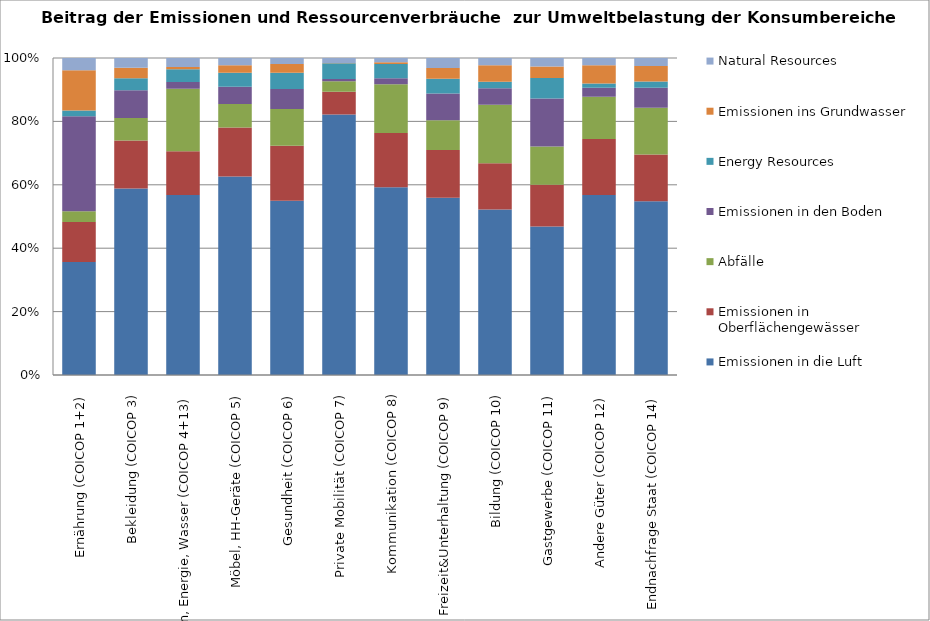
| Category | Emissionen in die Luft | Emissionen in Oberflächengewässer | Abfälle | Emissionen in den Boden | Energy Resources | Emissionen ins Grundwasser | Natural Resources |
|---|---|---|---|---|---|---|---|
| Ernährung (COICOP 1+2) | 0.1 | 0.035 | 0.01 | 0.084 | 0.005 | 0.036 | 0.011 |
| Bekleidung (COICOP 3) | 0.014 | 0.004 | 0.002 | 0.002 | 0.001 | 0.001 | 0.001 |
| Wohnen, Energie, Wasser (COICOP 4+13) | 0.138 | 0.034 | 0.048 | 0.005 | 0.01 | 0.002 | 0.007 |
| Möbel, HH-Geräte (COICOP 5) | 0.02 | 0.005 | 0.002 | 0.002 | 0.001 | 0.001 | 0.001 |
| Gesundheit (COICOP 6) | 0.039 | 0.012 | 0.008 | 0.005 | 0.004 | 0.002 | 0.001 |
| Private Mobilität (COICOP 7) | 0.101 | 0.009 | 0.004 | 0.001 | 0.006 | 0 | 0.002 |
| Kommunikation (COICOP 8) | 0.006 | 0.002 | 0.002 | 0 | 0 | 0 | 0 |
| Freizeit&Unterhaltung (COICOP 9) | 0.033 | 0.009 | 0.006 | 0.005 | 0.003 | 0.002 | 0.002 |
| Bildung (COICOP 10) | 0.014 | 0.004 | 0.005 | 0.001 | 0.001 | 0.001 | 0.001 |
| Gastgewerbe (COICOP 11) | 0.027 | 0.008 | 0.007 | 0.009 | 0.004 | 0.002 | 0.002 |
| Andere Güter (COICOP 12) | 0.021 | 0.007 | 0.005 | 0.001 | 0 | 0.002 | 0.001 |
| Endnachfrage Staat (COICOP 14) | 0.018 | 0.005 | 0.005 | 0.002 | 0.001 | 0.002 | 0.001 |